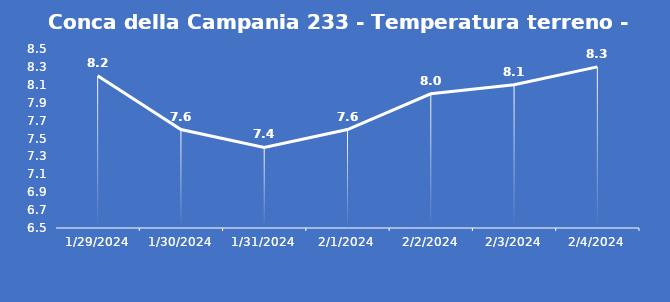
| Category | Conca della Campania 233 - Temperatura terreno - Grezzo (°C) |
|---|---|
| 1/29/24 | 8.2 |
| 1/30/24 | 7.6 |
| 1/31/24 | 7.4 |
| 2/1/24 | 7.6 |
| 2/2/24 | 8 |
| 2/3/24 | 8.1 |
| 2/4/24 | 8.3 |